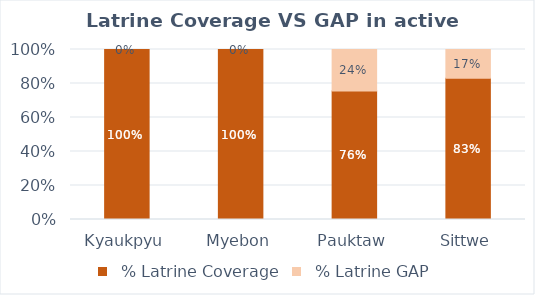
| Category |   % Latrine Coverage |   % Latrine GAP |
|---|---|---|
| Kyaukpyu | 1 | 0 |
| Myebon | 1 | 0 |
| Pauktaw | 0.757 | 0.243 |
| Sittwe | 0.831 | 0.169 |